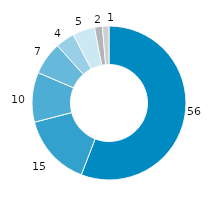
| Category | Baden-Württemberg |
|---|---|
| gesetzliche
Kranken-versicherung | 55.862 |
| private Haushalte u. private Organi-sationen o. E. | 15.127 |
| private
Kranken-versicherung | 10.454 |
| soziale Pflegeversicherung | 6.898 |
| öffentliche Haushalte | 4.002 |
| Arbeitgeber | 4.64 |
| gesetzliche Unfallversicherung | 1.642 |
| gesetzliche
Renten-
versicherung | 1.374 |